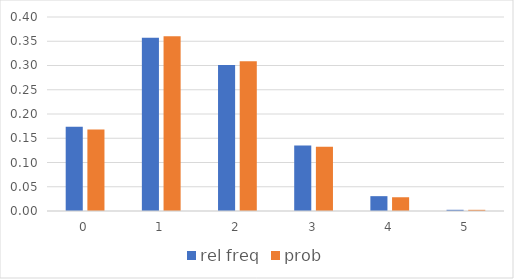
| Category | rel freq | prob |
|---|---|---|
| 0.0 | 0.174 | 0.168 |
| 1.0 | 0.357 | 0.36 |
| 2.0 | 0.301 | 0.309 |
| 3.0 | 0.135 | 0.132 |
| 4.0 | 0.031 | 0.028 |
| 5.0 | 0.002 | 0.002 |